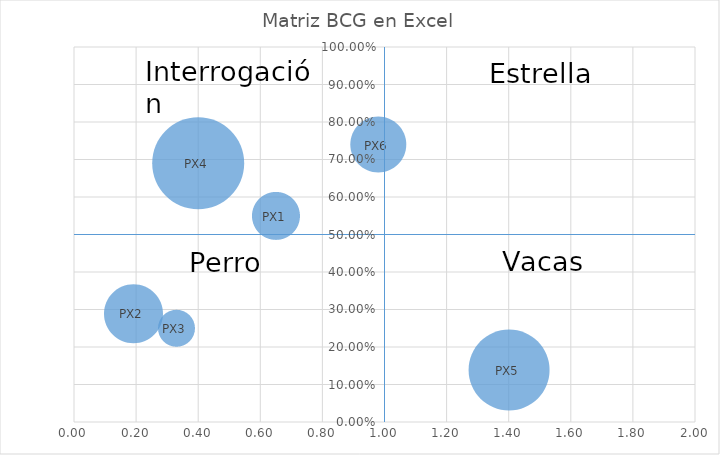
| Category | Series 0 |
|---|---|
| 0.65 | 0.55 |
| 0.19 | 0.29 |
| 0.33 | 0.25 |
| 0.4 | 0.69 |
| 1.4 | 0.14 |
| 0.98 | 0.74 |